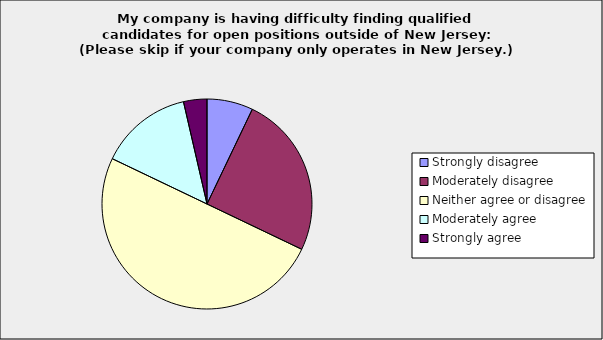
| Category | Series 0 |
|---|---|
| Strongly disagree | 0.071 |
| Moderately disagree | 0.25 |
| Neither agree or disagree | 0.5 |
| Moderately agree | 0.143 |
| Strongly agree | 0.036 |